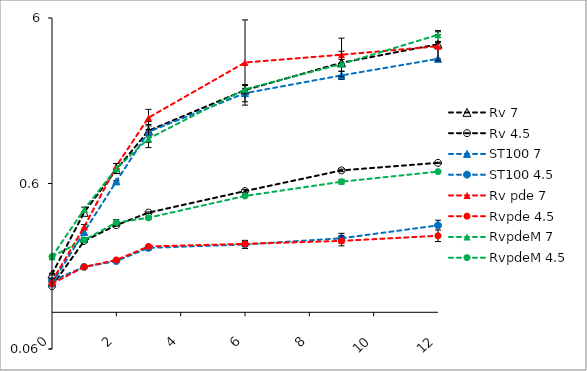
| Category | Rv 7 | Rv 4.5 | ST100 7 | ST100 4.5 | Rv pde 7  | Rvpde 4.5 | RvpdeM 7 | RvpdeM 4.5 |
|---|---|---|---|---|---|---|---|---|
| 0.0 | 0.17 | 0.144 | 0.15 | 0.155 | 0.154 | 0.149 | 0.217 | 0.217 |
| 1.0 | 0.402 | 0.27 | 0.306 | 0.188 | 0.328 | 0.188 | 0.418 | 0.273 |
| 2.0 | 0.728 | 0.336 | 0.618 | 0.204 | 0.764 | 0.207 | 0.74 | 0.349 |
| 3.0 | 1.25 | 0.4 | 1.23 | 0.245 | 1.5 | 0.25 | 1.121 | 0.372 |
| 6.0 | 2.2 | 0.54 | 2.108 | 0.257 | 3.23 | 0.259 | 2.225 | 0.504 |
| 9.0 | 3.22 | 0.72 | 2.7 | 0.28 | 3.6 | 0.27 | 3.164 | 0.615 |
| 12.0 | 4.167 | 0.8 | 3.4 | 0.335 | 4.05 | 0.29 | 4.751 | 0.708 |